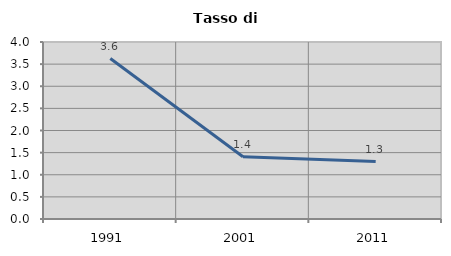
| Category | Tasso di disoccupazione   |
|---|---|
| 1991.0 | 3.627 |
| 2001.0 | 1.408 |
| 2011.0 | 1.299 |